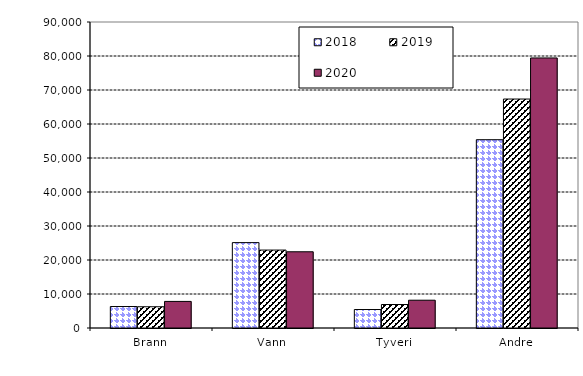
| Category | 2018 | 2019 | 2020 |
|---|---|---|---|
| Brann | 6317.398 | 6246.066 | 7817.288 |
| Vann | 25111.389 | 22919.925 | 22417.309 |
| Tyveri | 5432.86 | 6910.102 | 8173.27 |
| Andre | 55384.087 | 67340.428 | 79429.819 |